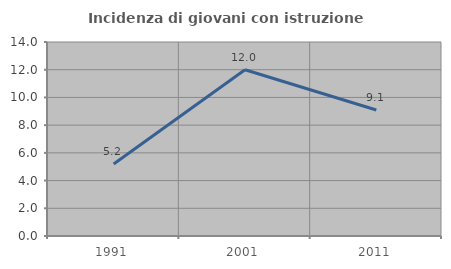
| Category | Incidenza di giovani con istruzione universitaria |
|---|---|
| 1991.0 | 5.195 |
| 2001.0 | 12 |
| 2011.0 | 9.091 |